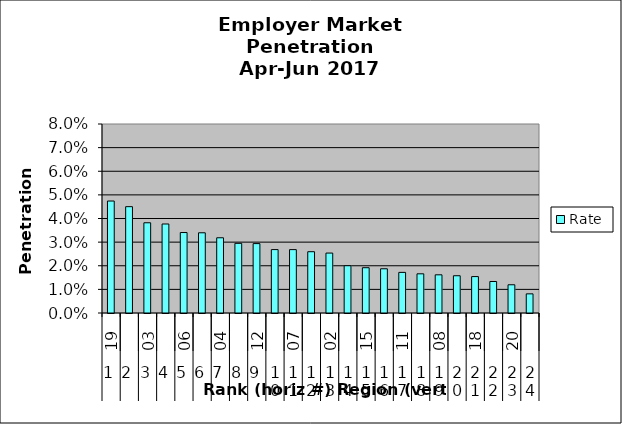
| Category | Rate |
|---|---|
| 0 | 0.047 |
| 1 | 0.045 |
| 2 | 0.038 |
| 3 | 0.038 |
| 4 | 0.034 |
| 5 | 0.034 |
| 6 | 0.032 |
| 7 | 0.029 |
| 8 | 0.029 |
| 9 | 0.027 |
| 10 | 0.027 |
| 11 | 0.026 |
| 12 | 0.025 |
| 13 | 0.02 |
| 14 | 0.019 |
| 15 | 0.019 |
| 16 | 0.017 |
| 17 | 0.017 |
| 18 | 0.016 |
| 19 | 0.016 |
| 20 | 0.015 |
| 21 | 0.013 |
| 22 | 0.012 |
| 23 | 0.008 |